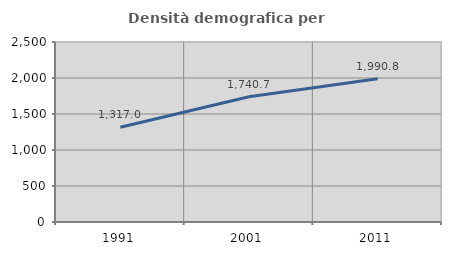
| Category | Densità demografica |
|---|---|
| 1991.0 | 1317.014 |
| 2001.0 | 1740.691 |
| 2011.0 | 1990.803 |